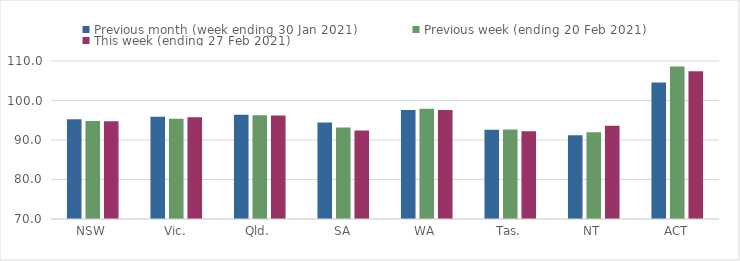
| Category | Previous month (week ending 30 Jan 2021) | Previous week (ending 20 Feb 2021) | This week (ending 27 Feb 2021) |
|---|---|---|---|
| NSW | 95.26 | 94.8 | 94.72 |
| Vic. | 95.91 | 95.4 | 95.77 |
| Qld. | 96.42 | 96.27 | 96.2 |
| SA | 94.45 | 93.14 | 92.39 |
| WA | 97.61 | 97.91 | 97.58 |
| Tas. | 92.61 | 92.65 | 92.24 |
| NT | 91.2 | 91.99 | 93.61 |
| ACT | 104.53 | 108.6 | 107.43 |